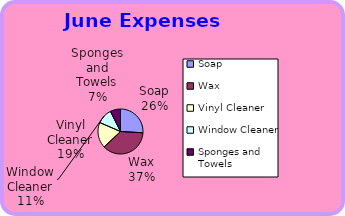
| Category | June Expenses Budget |
|---|---|
| Soap | 35 |
| Wax | 50 |
| Vinyl Cleaner | 25 |
| Window Cleaner | 15 |
| Sponges and Towels | 10 |